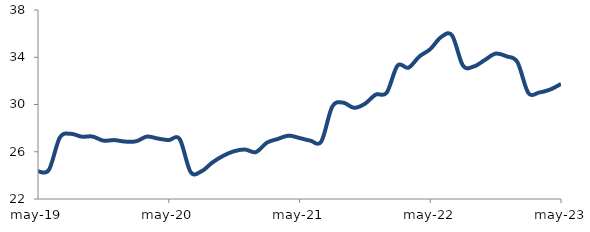
| Category | Series 0 |
|---|---|
| 2019-05-01 | 24.342 |
| 2019-06-01 | 24.467 |
| 2019-07-01 | 27.194 |
| 2019-08-01 | 27.519 |
| 2019-09-01 | 27.279 |
| 2019-10-01 | 27.289 |
| 2019-11-01 | 26.942 |
| 2019-12-01 | 26.986 |
| 2020-01-01 | 26.86 |
| 2020-02-01 | 26.885 |
| 2020-03-01 | 27.282 |
| 2020-04-01 | 27.118 |
| 2020-05-01 | 26.986 |
| 2020-06-01 | 27.082 |
| 2020-07-01 | 24.291 |
| 2020-08-01 | 24.343 |
| 2020-09-01 | 25.089 |
| 2020-10-01 | 25.658 |
| 2020-11-01 | 26.044 |
| 2020-12-01 | 26.188 |
| 2021-01-01 | 25.972 |
| 2021-02-01 | 26.764 |
| 2021-03-01 | 27.083 |
| 2021-04-01 | 27.363 |
| 2021-05-01 | 27.164 |
| 2021-06-01 | 26.939 |
| 2021-07-01 | 26.864 |
| 2021-08-01 | 29.808 |
| 2021-09-01 | 30.158 |
| 2021-10-01 | 29.722 |
| 2021-11-01 | 30.058 |
| 2021-12-01 | 30.839 |
| 2022-01-01 | 30.999 |
| 2022-02-01 | 33.297 |
| 2022-03-01 | 33.114 |
| 2022-04-01 | 34.066 |
| 2022-05-01 | 34.685 |
| 2022-06-01 | 35.71 |
| 2022-07-01 | 35.85 |
| 2022-08-01 | 33.294 |
| 2022-09-01 | 33.218 |
| 2022-10-01 | 33.762 |
| 2022-11-01 | 34.307 |
| 2022-12-01 | 34.079 |
| 2023-01-01 | 33.585 |
| 2023-02-01 | 30.978 |
| 2023-03-01 | 31.014 |
| 2023-04-01 | 31.263 |
| 2023-05-01 | 31.74 |